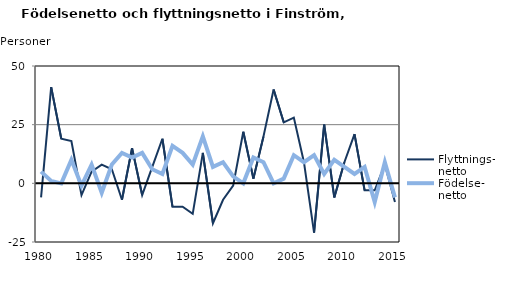
| Category | Flyttnings- netto | Födelse- netto |
|---|---|---|
| 1980.0 | -6 | 5 |
| 1981.0 | 41 | 1 |
| 1982.0 | 19 | 0 |
| 1983.0 | 18 | 10 |
| 1984.0 | -5 | -1 |
| 1985.0 | 5 | 8 |
| 1986.0 | 8 | -4 |
| 1987.0 | 6 | 8 |
| 1988.0 | -7 | 13 |
| 1989.0 | 15 | 11 |
| 1990.0 | -5 | 13 |
| 1991.0 | 7 | 6 |
| 1992.0 | 19 | 4 |
| 1993.0 | -10 | 16 |
| 1994.0 | -10 | 13 |
| 1995.0 | -13 | 8 |
| 1996.0 | 13 | 20 |
| 1997.0 | -17 | 7 |
| 1998.0 | -7 | 9 |
| 1999.0 | -1 | 3 |
| 2000.0 | 22 | 0 |
| 2001.0 | 2 | 11 |
| 2002.0 | 20 | 9 |
| 2003.0 | 40 | 0 |
| 2004.0 | 26 | 2 |
| 2005.0 | 28 | 12 |
| 2006.0 | 9 | 9 |
| 2007.0 | -21 | 12 |
| 2008.0 | 25 | 4 |
| 2009.0 | -6 | 10 |
| 2010.0 | 9 | 7 |
| 2011.0 | 21 | 4 |
| 2012.0 | -3 | 7 |
| 2013.0 | -3 | -8 |
| 2014.0 | 8 | 9 |
| 2015.0 | -8 | -6 |